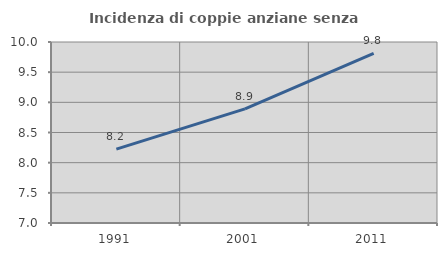
| Category | Incidenza di coppie anziane senza figli  |
|---|---|
| 1991.0 | 8.225 |
| 2001.0 | 8.891 |
| 2011.0 | 9.811 |